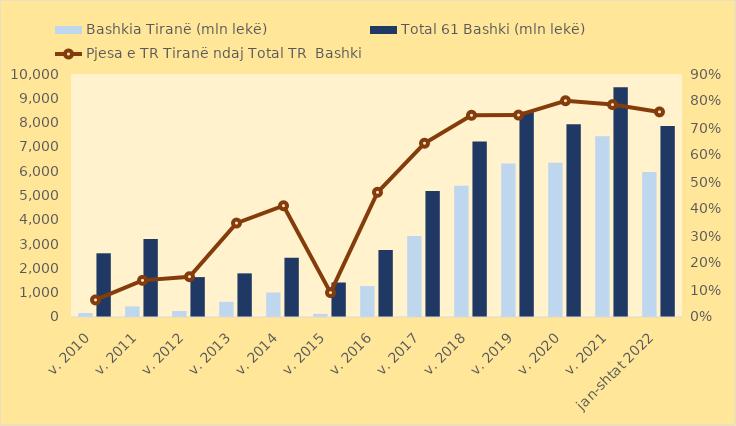
| Category | Bashkia Tiranë (mln lekë) | Total 61 Bashki (mln lekë) |
|---|---|---|
| v. 2010 | 165.841 | 2621.84 |
| v. 2011 | 435.47 | 3209.29 |
| v. 2012 | 245.071 | 1641.91 |
| v. 2013 | 624.719 | 1796.02 |
| v. 2014 | 1004.843 | 2438.62 |
| v. 2015 | 128.325 | 1419.77 |
| v. 2016 | 1272.832 | 2755.43 |
| v. 2017 | 3334.883 | 5182.07 |
| v. 2018 | 5398.329 | 7224.96 |
| v. 2019 | 6315.307 | 8443.64 |
| v. 2020 | 6350.959 | 7929.62 |
| v. 2021 | 7438.142 | 9455.79 |
| jan-shtat 2022 | 5970.839 | 7860.6 |